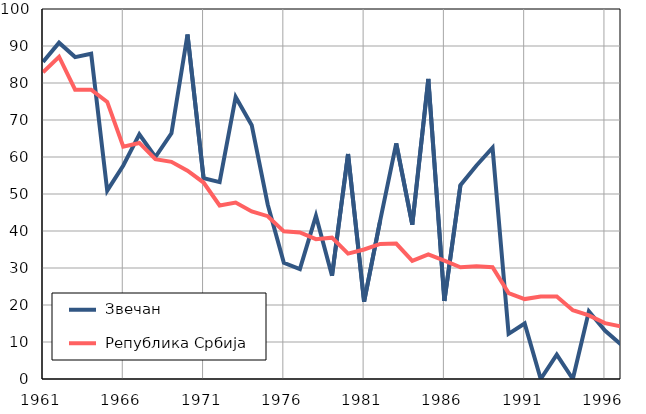
| Category |  Звечан |  Република Србија |
|---|---|---|
| 1961.0 | 85.7 | 82.9 |
| 1962.0 | 90.9 | 87.1 |
| 1963.0 | 87 | 78.2 |
| 1964.0 | 87.9 | 78.2 |
| 1965.0 | 50.9 | 74.9 |
| 1966.0 | 57.7 | 62.8 |
| 1967.0 | 66.1 | 63.8 |
| 1968.0 | 60 | 59.4 |
| 1969.0 | 66.4 | 58.7 |
| 1970.0 | 93.1 | 56.3 |
| 1971.0 | 54.3 | 53.1 |
| 1972.0 | 53.2 | 46.9 |
| 1973.0 | 76.2 | 47.7 |
| 1974.0 | 68.6 | 45.3 |
| 1975.0 | 47.1 | 44 |
| 1976.0 | 31.4 | 39.9 |
| 1977.0 | 29.7 | 39.6 |
| 1978.0 | 44.1 | 37.8 |
| 1979.0 | 27.9 | 38.2 |
| 1980.0 | 60.8 | 33.9 |
| 1981.0 | 20.9 | 35 |
| 1982.0 | 42.8 | 36.5 |
| 1983.0 | 63.7 | 36.6 |
| 1984.0 | 41.7 | 31.9 |
| 1985.0 | 81.1 | 33.7 |
| 1986.0 | 21.1 | 32 |
| 1987.0 | 52.4 | 30.2 |
| 1988.0 | 57.7 | 30.5 |
| 1989.0 | 62.5 | 30.2 |
| 1990.0 | 12.2 | 23.2 |
| 1991.0 | 15 | 21.6 |
| 1992.0 | 0 | 22.3 |
| 1993.0 | 6.6 | 22.3 |
| 1994.0 | 0 | 18.6 |
| 1995.0 | 18.3 | 17.2 |
| 1996.0 | 13.1 | 15.1 |
| 1997.0 | 9.3 | 14.2 |